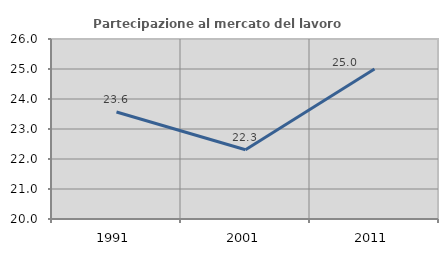
| Category | Partecipazione al mercato del lavoro  femminile |
|---|---|
| 1991.0 | 23.567 |
| 2001.0 | 22.308 |
| 2011.0 | 25 |